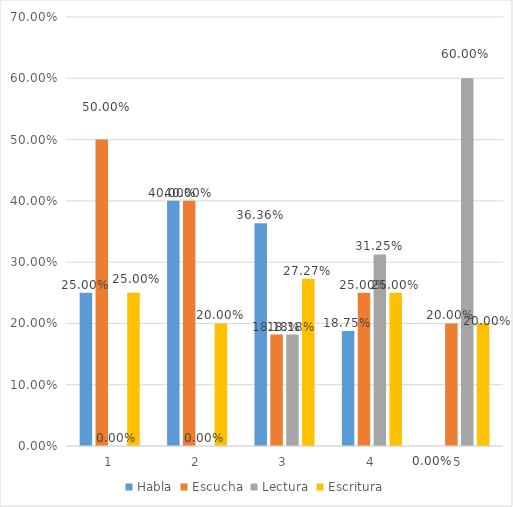
| Category | Habla | Escucha | Lectura | Escritura |
|---|---|---|---|---|
| 0 | 0.25 | 0.5 | 0 | 0.25 |
| 1 | 0.4 | 0.4 | 0 | 0.2 |
| 2 | 0.364 | 0.182 | 0.182 | 0.273 |
| 3 | 0.188 | 0.25 | 0.312 | 0.25 |
| 4 | 0 | 0.2 | 0.6 | 0.2 |